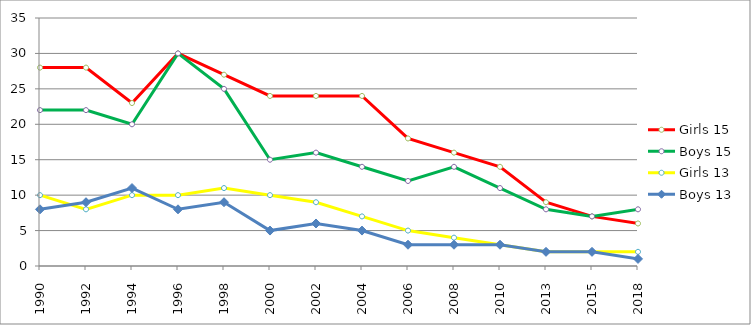
| Category | Girls 15 | Boys 15 | Girls 13 | Boys 13 |
|---|---|---|---|---|
| 1990.0 | 28 | 22 | 10 | 8 |
| 1992.0 | 28 | 22 | 8 | 9 |
| 1994.0 | 23 | 20 | 10 | 11 |
| 1996.0 | 30 | 30 | 10 | 8 |
| 1998.0 | 27 | 25 | 11 | 9 |
| 2000.0 | 24 | 15 | 10 | 5 |
| 2002.0 | 24 | 16 | 9 | 6 |
| 2004.0 | 24 | 14 | 7 | 5 |
| 2006.0 | 18 | 12 | 5 | 3 |
| 2008.0 | 16 | 14 | 4 | 3 |
| 2010.0 | 14 | 11 | 3 | 3 |
| 2013.0 | 9 | 8 | 2 | 2 |
| 2015.0 | 7 | 7 | 2 | 2 |
| 2018.0 | 6 | 8 | 2 | 1 |